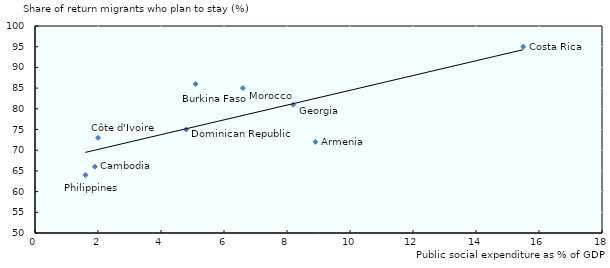
| Category | Series 0 |
|---|---|
| 8.9 | 72 |
| 5.1 | 86 |
| 1.9 | 66 |
| 15.5 | 95 |
| 2.0 | 73 |
| 4.8 | 75 |
| 8.2 | 81 |
| nan | 81 |
| 6.6 | 85 |
| 1.6 | 64 |